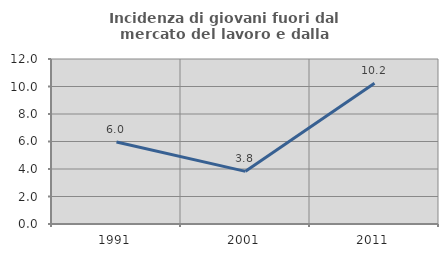
| Category | Incidenza di giovani fuori dal mercato del lavoro e dalla formazione  |
|---|---|
| 1991.0 | 5.963 |
| 2001.0 | 3.83 |
| 2011.0 | 10.233 |